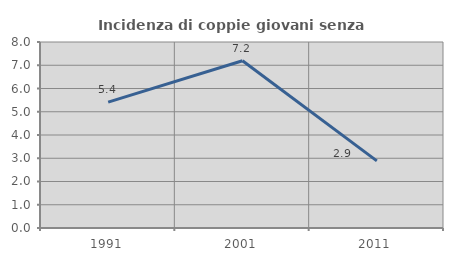
| Category | Incidenza di coppie giovani senza figli |
|---|---|
| 1991.0 | 5.412 |
| 2001.0 | 7.192 |
| 2011.0 | 2.886 |